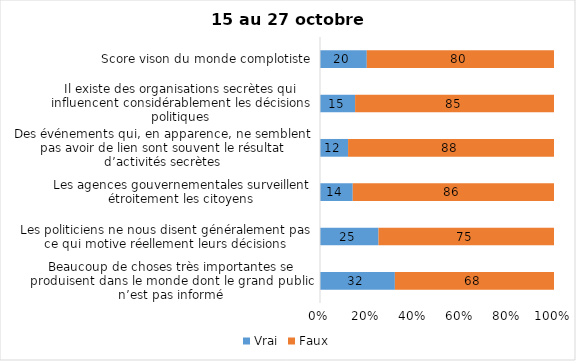
| Category | Vrai | Faux |
|---|---|---|
| Beaucoup de choses très importantes se produisent dans le monde dont le grand public n’est pas informé | 32 | 68 |
| Les politiciens ne nous disent généralement pas ce qui motive réellement leurs décisions | 25 | 75 |
| Les agences gouvernementales surveillent étroitement les citoyens | 14 | 86 |
| Des événements qui, en apparence, ne semblent pas avoir de lien sont souvent le résultat d’activités secrètes | 12 | 88 |
| Il existe des organisations secrètes qui influencent considérablement les décisions politiques | 15 | 85 |
| Score vison du monde complotiste | 20 | 80 |